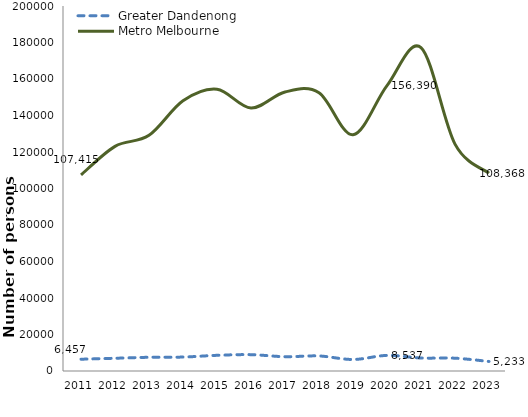
| Category | Greater Dandenong  | Metro Melbourne |
|---|---|---|
| 2011.0 | 6457 | 107415 |
| 2012.0 | 6979 | 123093 |
| 2013.0 | 7516 | 129116 |
| 2014.0 | 7635 | 148073 |
| 2015.0 | 8591 | 154394 |
| 2016.0 | 8958 | 144126 |
| 2017.0 | 7832 | 152908 |
| 2018.0 | 8244 | 152522 |
| 2019.0 | 6311 | 129415 |
| 2020.0 | 8537 | 156390 |
| 2021.0 | 7121 | 177197 |
| 2022.0 | 7014 | 124331 |
| 2023.0 | 5233 | 108368 |